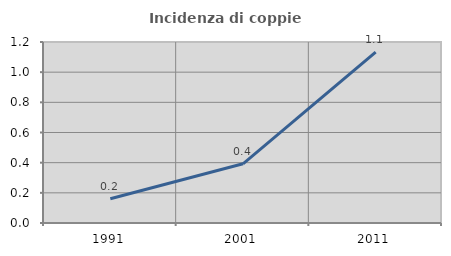
| Category | Incidenza di coppie miste |
|---|---|
| 1991.0 | 0.161 |
| 2001.0 | 0.392 |
| 2011.0 | 1.134 |